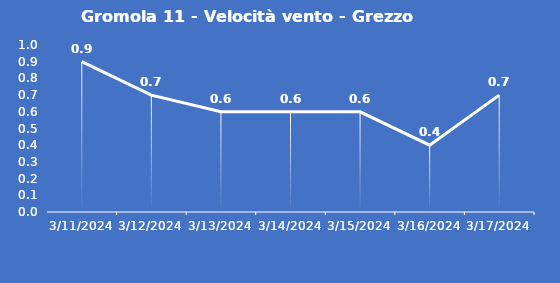
| Category | Gromola 11 - Velocità vento - Grezzo (m/s) |
|---|---|
| 3/11/24 | 0.9 |
| 3/12/24 | 0.7 |
| 3/13/24 | 0.6 |
| 3/14/24 | 0.6 |
| 3/15/24 | 0.6 |
| 3/16/24 | 0.4 |
| 3/17/24 | 0.7 |